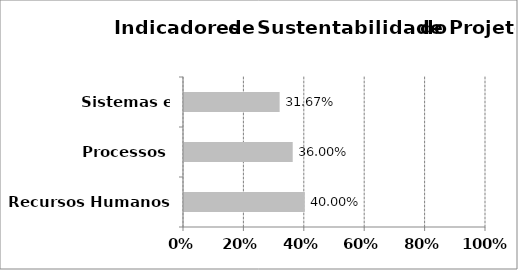
| Category | Series 0 |
|---|---|
| Recursos Humanos | 0.4 |
| Processos | 0.36 |
| Sistemas e Tecnologia | 0.317 |